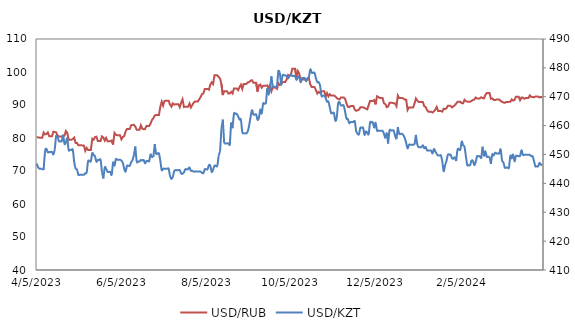
| Category | USD/RUB |
|---|---|
| 4/3/24 | 92.296 |
| 4/2/24 | 92.47 |
| 4/1/24 | 92.282 |
| 3/31/24 | 92.57 |
| 3/30/24 | 92.57 |
| 3/29/24 | 92.57 |
| 3/28/24 | 92.323 |
| 3/27/24 | 92.446 |
| 3/26/24 | 92.47 |
| 3/25/24 | 92.896 |
| 3/24/24 | 92.12 |
| 3/23/24 | 92.12 |
| 3/22/24 | 92.12 |
| 3/21/24 | 91.87 |
| 3/20/24 | 92.246 |
| 3/19/24 | 92.243 |
| 3/18/24 | 91.442 |
| 3/17/24 | 92.52 |
| 3/16/24 | 92.52 |
| 3/15/24 | 92.52 |
| 3/14/24 | 91.52 |
| 3/13/24 | 91.346 |
| 3/12/24 | 91.686 |
| 3/11/24 | 90.996 |
| 3/10/24 | 90.945 |
| 3/9/24 | 90.945 |
| 3/8/24 | 90.945 |
| 3/7/24 | 90.646 |
| 3/6/24 | 90.75 |
| 3/5/24 | 90.97 |
| 3/4/24 | 91.218 |
| 3/3/24 | 91.697 |
| 3/2/24 | 91.697 |
| 3/1/24 | 91.697 |
| 2/29/24 | 91.496 |
| 2/28/24 | 91.546 |
| 2/27/24 | 92.02 |
| 2/26/24 | 91.874 |
| 2/25/24 | 93.62 |
| 2/24/24 | 93.62 |
| 2/23/24 | 93.62 |
| 2/22/24 | 93.046 |
| 2/21/24 | 91.996 |
| 2/20/24 | 92.106 |
| 2/19/24 | 92.346 |
| 2/18/24 | 91.996 |
| 2/17/24 | 91.996 |
| 2/16/24 | 91.996 |
| 2/15/24 | 92.27 |
| 2/14/24 | 91.646 |
| 2/13/24 | 91.496 |
| 2/12/24 | 91.22 |
| 2/11/24 | 90.996 |
| 2/10/24 | 90.996 |
| 2/9/24 | 90.996 |
| 2/8/24 | 91.17 |
| 2/7/24 | 91.596 |
| 2/6/24 | 90.515 |
| 2/5/24 | 90.546 |
| 2/4/24 | 90.996 |
| 2/3/24 | 90.996 |
| 2/2/24 | 90.996 |
| 2/1/24 | 90.416 |
| 1/31/24 | 89.946 |
| 1/30/24 | 89.57 |
| 1/29/24 | 89.27 |
| 1/28/24 | 89.746 |
| 1/27/24 | 89.746 |
| 1/26/24 | 89.746 |
| 1/25/24 | 89.02 |
| 1/24/24 | 88.746 |
| 1/23/24 | 88.869 |
| 1/22/24 | 87.996 |
| 1/21/24 | 88.17 |
| 1/20/24 | 88.17 |
| 1/19/24 | 88.17 |
| 1/18/24 | 89.42 |
| 1/17/24 | 88.62 |
| 1/16/24 | 88.096 |
| 1/15/24 | 87.72 |
| 1/14/24 | 87.956 |
| 1/13/24 | 87.956 |
| 1/12/24 | 87.956 |
| 1/11/24 | 88.496 |
| 1/10/24 | 89.378 |
| 1/9/24 | 89.633 |
| 1/8/24 | 90.898 |
| 1/7/24 | 90.92 |
| 1/6/24 | 90.92 |
| 1/5/24 | 90.92 |
| 1/4/24 | 91.346 |
| 1/3/24 | 91.996 |
| 1/2/24 | 90.42 |
| 1/1/24 | 89.246 |
| 12/31/23 | 89.246 |
| 12/30/23 | 89.246 |
| 12/29/23 | 89.246 |
| 12/28/23 | 88.496 |
| 12/27/23 | 91.62 |
| 12/26/23 | 91.628 |
| 12/25/23 | 91.982 |
| 12/24/23 | 92.12 |
| 12/23/23 | 92.12 |
| 12/22/23 | 92.12 |
| 12/21/23 | 92.87 |
| 12/20/23 | 89.648 |
| 12/19/23 | 90.47 |
| 12/18/23 | 90.52 |
| 12/17/23 | 90.646 |
| 12/16/23 | 90.646 |
| 12/15/23 | 90.646 |
| 12/14/23 | 89.52 |
| 12/13/23 | 89.346 |
| 12/12/23 | 90.25 |
| 12/11/23 | 90.528 |
| 12/10/23 | 92.146 |
| 12/9/23 | 92.146 |
| 12/8/23 | 92.146 |
| 12/7/23 | 92.42 |
| 12/6/23 | 92.65 |
| 12/5/23 | 90.202 |
| 12/4/23 | 91.496 |
| 12/3/23 | 91.22 |
| 12/2/23 | 91.22 |
| 12/1/23 | 91.22 |
| 11/30/23 | 89.97 |
| 11/29/23 | 88.696 |
| 11/28/23 | 88.87 |
| 11/27/23 | 89.07 |
| 11/26/23 | 89.296 |
| 11/25/23 | 89.296 |
| 11/24/23 | 89.296 |
| 11/23/23 | 88.57 |
| 11/22/23 | 88.396 |
| 11/21/23 | 88.24 |
| 11/20/23 | 88.546 |
| 11/19/23 | 89.723 |
| 11/18/23 | 89.723 |
| 11/17/23 | 89.723 |
| 11/16/23 | 89.346 |
| 11/15/23 | 89.446 |
| 11/14/23 | 90.52 |
| 11/13/23 | 91.91 |
| 11/12/23 | 92.27 |
| 11/11/23 | 92.27 |
| 11/10/23 | 92.27 |
| 11/9/23 | 91.67 |
| 11/8/23 | 91.846 |
| 11/7/23 | 92.096 |
| 11/6/23 | 92.646 |
| 11/5/23 | 92.846 |
| 11/4/23 | 92.846 |
| 11/3/23 | 92.846 |
| 11/2/23 | 93.27 |
| 11/1/23 | 92.596 |
| 10/31/23 | 93.596 |
| 10/30/23 | 92.546 |
| 10/29/23 | 94.196 |
| 10/28/23 | 94.196 |
| 10/27/23 | 94.196 |
| 10/26/23 | 93.646 |
| 10/25/23 | 93.996 |
| 10/24/23 | 93.47 |
| 10/23/23 | 94.496 |
| 10/22/23 | 95.446 |
| 10/21/23 | 95.446 |
| 10/20/23 | 95.446 |
| 10/19/23 | 96.17 |
| 10/18/23 | 98.106 |
| 10/17/23 | 98.02 |
| 10/16/23 | 97.42 |
| 10/15/23 | 97.696 |
| 10/14/23 | 97.696 |
| 10/13/23 | 97.696 |
| 10/12/23 | 97.72 |
| 10/11/23 | 99.5 |
| 10/10/23 | 100.296 |
| 10/9/23 | 98.5 |
| 10/8/23 | 100.996 |
| 10/7/23 | 100.996 |
| 10/6/23 | 100.996 |
| 10/5/23 | 99.125 |
| 10/4/23 | 98.8 |
| 10/3/23 | 99.1 |
| 10/2/23 | 97.8 |
| 10/1/23 | 97 |
| 9/30/23 | 97 |
| 9/29/23 | 97 |
| 9/28/23 | 96.246 |
| 9/27/23 | 96.075 |
| 9/26/23 | 96.596 |
| 9/25/23 | 94.905 |
| 9/24/23 | 95.3 |
| 9/23/23 | 95.3 |
| 9/22/23 | 95.3 |
| 9/21/23 | 94.2 |
| 9/20/23 | 96.02 |
| 9/19/23 | 95 |
| 9/18/23 | 95.946 |
| 9/17/23 | 95.8 |
| 9/16/23 | 95.8 |
| 9/15/23 | 95.8 |
| 9/14/23 | 95.25 |
| 9/13/23 | 96.196 |
| 9/12/23 | 95.996 |
| 9/11/23 | 94.05 |
| 9/10/23 | 96.75 |
| 9/9/23 | 96.75 |
| 9/8/23 | 96.75 |
| 9/7/23 | 97.5 |
| 9/6/23 | 97.4 |
| 9/5/23 | 96.935 |
| 9/4/23 | 96.87 |
| 9/3/23 | 96.4 |
| 9/2/23 | 96.4 |
| 9/1/23 | 96.4 |
| 8/31/23 | 94.875 |
| 8/30/23 | 96.146 |
| 8/29/23 | 95.42 |
| 8/28/23 | 94.496 |
| 8/27/23 | 94.996 |
| 8/26/23 | 94.996 |
| 8/25/23 | 94.996 |
| 8/24/23 | 93.5 |
| 8/23/23 | 93.996 |
| 8/22/23 | 93.5 |
| 8/21/23 | 93.496 |
| 8/20/23 | 94.2 |
| 8/19/23 | 94.2 |
| 8/18/23 | 94.2 |
| 8/17/23 | 93 |
| 8/16/23 | 96.35 |
| 8/15/23 | 98 |
| 8/14/23 | 98.496 |
| 8/13/23 | 98.995 |
| 8/12/23 | 98.995 |
| 8/11/23 | 98.995 |
| 8/10/23 | 96.33 |
| 8/9/23 | 96.87 |
| 8/8/23 | 96.205 |
| 8/7/23 | 94.625 |
| 8/6/23 | 94.875 |
| 8/5/23 | 94.875 |
| 8/4/23 | 94.875 |
| 8/3/23 | 93.5 |
| 8/2/23 | 93.31 |
| 8/1/23 | 92.396 |
| 7/31/23 | 91.746 |
| 7/30/23 | 91.06 |
| 7/29/23 | 91.06 |
| 7/28/23 | 91.06 |
| 7/27/23 | 90.696 |
| 7/26/23 | 89.996 |
| 7/25/23 | 89.25 |
| 7/24/23 | 90.446 |
| 7/23/23 | 89.5 |
| 7/22/23 | 89.5 |
| 7/21/23 | 89.5 |
| 7/20/23 | 89.4 |
| 7/19/23 | 91.72 |
| 7/18/23 | 90.746 |
| 7/17/23 | 89.35 |
| 7/16/23 | 90.246 |
| 7/15/23 | 90.246 |
| 7/14/23 | 90.246 |
| 7/13/23 | 90.12 |
| 7/12/23 | 90.496 |
| 7/11/23 | 89.5 |
| 7/10/23 | 90.1 |
| 7/9/23 | 91.256 |
| 7/8/23 | 91.256 |
| 7/7/23 | 91.256 |
| 7/6/23 | 91.246 |
| 7/5/23 | 89.8 |
| 7/4/23 | 90.996 |
| 7/3/23 | 89.496 |
| 7/2/23 | 86.95 |
| 7/1/23 | 86.95 |
| 6/30/23 | 86.95 |
| 6/29/23 | 86.856 |
| 6/28/23 | 85.996 |
| 6/27/23 | 85.47 |
| 6/26/23 | 84.4 |
| 6/25/23 | 83.646 |
| 6/24/23 | 83.646 |
| 6/23/23 | 83.646 |
| 6/22/23 | 82.708 |
| 6/21/23 | 82.65 |
| 6/20/23 | 82.85 |
| 6/19/23 | 83.846 |
| 6/18/23 | 82.5 |
| 6/17/23 | 82.5 |
| 6/16/23 | 82.5 |
| 6/15/23 | 83.47 |
| 6/14/23 | 83.996 |
| 6/13/23 | 83.946 |
| 6/12/23 | 83.87 |
| 6/11/23 | 82.72 |
| 6/10/23 | 82.72 |
| 6/9/23 | 82.72 |
| 6/8/23 | 82 |
| 6/7/23 | 80.55 |
| 6/6/23 | 80.35 |
| 6/5/23 | 79.6 |
| 6/4/23 | 80.796 |
| 6/3/23 | 80.796 |
| 6/2/23 | 80.796 |
| 6/1/23 | 80.996 |
| 5/31/23 | 81.546 |
| 5/30/23 | 78.015 |
| 5/29/23 | 79.25 |
| 5/28/23 | 78.996 |
| 5/27/23 | 78.996 |
| 5/26/23 | 78.996 |
| 5/25/23 | 80.02 |
| 5/24/23 | 79.21 |
| 5/23/23 | 80.15 |
| 5/22/23 | 80.496 |
| 5/21/23 | 79.1 |
| 5/20/23 | 79.1 |
| 5/19/23 | 79.1 |
| 5/18/23 | 80.396 |
| 5/17/23 | 80.296 |
| 5/16/23 | 79.49 |
| 5/15/23 | 79.77 |
| 5/14/23 | 76.36 |
| 5/13/23 | 76.36 |
| 5/12/23 | 76.36 |
| 5/11/23 | 76.996 |
| 5/10/23 | 76.1 |
| 5/9/23 | 77.693 |
| 5/8/23 | 77.72 |
| 5/7/23 | 77.806 |
| 5/6/23 | 77.806 |
| 5/5/23 | 77.806 |
| 5/4/23 | 78.496 |
| 5/3/23 | 78.5 |
| 5/2/23 | 80.106 |
| 5/1/23 | 79.7 |
| 4/30/23 | 79.45 |
| 4/29/23 | 79.45 |
| 4/28/23 | 79.45 |
| 4/27/23 | 81.596 |
| 4/26/23 | 82.12 |
| 4/25/23 | 80.7 |
| 4/24/23 | 80.495 |
| 4/23/23 | 80.45 |
| 4/22/23 | 80.45 |
| 4/21/23 | 80.45 |
| 4/20/23 | 80.8 |
| 4/19/23 | 81.696 |
| 4/18/23 | 81.826 |
| 4/17/23 | 81.893 |
| 4/16/23 | 80.55 |
| 4/15/23 | 80.55 |
| 4/14/23 | 80.55 |
| 4/13/23 | 81.696 |
| 4/12/23 | 81.22 |
| 4/11/23 | 81.096 |
| 4/10/23 | 81.65 |
| 4/9/23 | 80.1 |
| 4/8/23 | 80.1 |
| 4/7/23 | 80.1 |
| 4/6/23 | 80.2 |
| 4/5/23 | 80.196 |